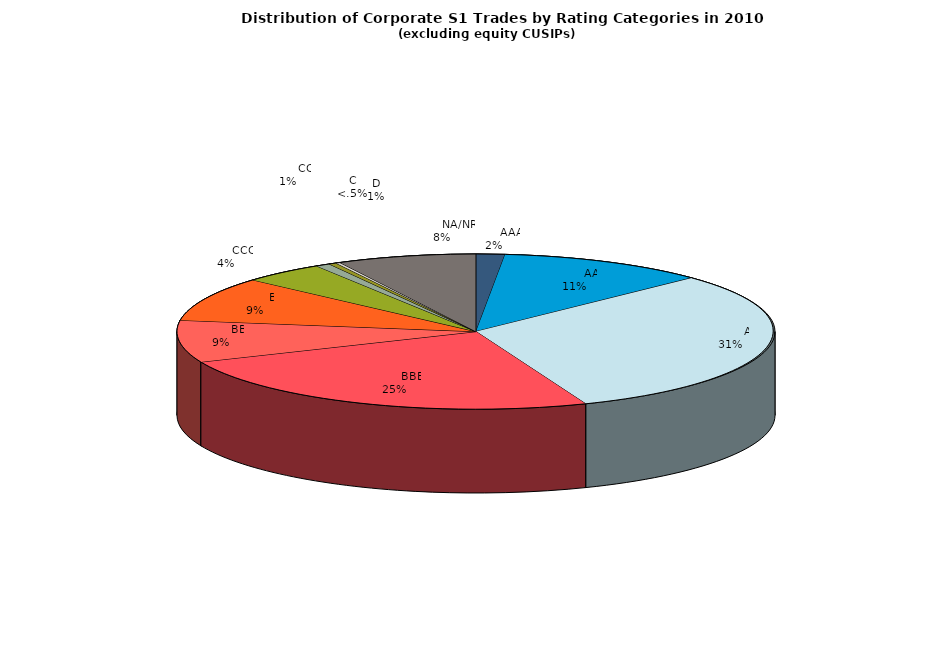
| Category | Series 0 |
|---|---|
|         AAA | 651.369 |
|         AA | 4722.873 |
|         A | 13063.552 |
|         BBB | 10289.929 |
|         BB | 3664.552 |
|         B | 3875.698 |
|         CCC | 1864.595 |
|         CC | 326.873 |
|         C | 170.23 |
|         D | 99.865 |
|         NA/NR | 3152.198 |